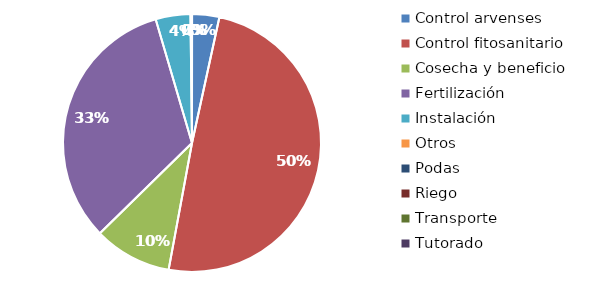
| Category | Valor |
|---|---|
| Control arvenses | 432000 |
| Control fitosanitario | 6262000 |
| Cosecha y beneficio | 1233600 |
| Fertilización | 4150000 |
| Instalación | 551250 |
| Otros | 24000 |
| Podas | 0 |
| Riego | 0 |
| Transporte | 0 |
| Tutorado | 0 |